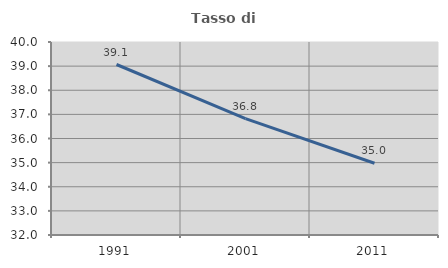
| Category | Tasso di occupazione   |
|---|---|
| 1991.0 | 39.067 |
| 2001.0 | 36.822 |
| 2011.0 | 34.975 |